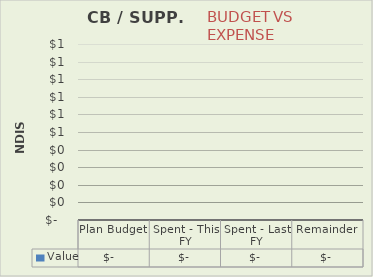
| Category | Value |
|---|---|
| Plan Budget | 0 |
| Spent - This FY | 0 |
| Spent - Last FY | 0 |
| Remainder | 0 |